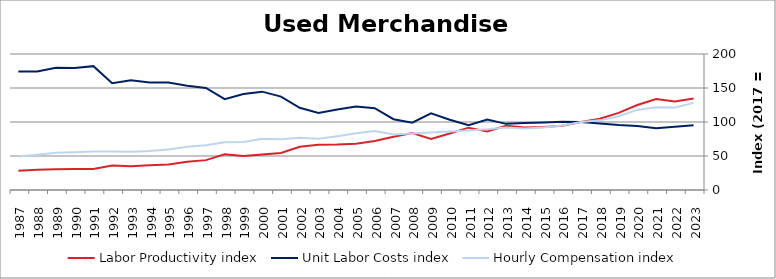
| Category | Labor Productivity index | Unit Labor Costs index | Hourly Compensation index |
|---|---|---|---|
| 2023.0 | 134.531 | 95.231 | 128.116 |
| 2022.0 | 130.184 | 93.104 | 121.207 |
| 2021.0 | 133.857 | 90.777 | 121.511 |
| 2020.0 | 124.947 | 94.259 | 117.774 |
| 2019.0 | 113.371 | 95.642 | 108.43 |
| 2018.0 | 104.808 | 97.713 | 102.411 |
| 2017.0 | 100 | 100 | 100 |
| 2016.0 | 94.588 | 100.33 | 94.9 |
| 2015.0 | 92.56 | 99.139 | 91.763 |
| 2014.0 | 91.969 | 98.497 | 90.587 |
| 2013.0 | 94.587 | 97.275 | 92.009 |
| 2012.0 | 86.178 | 103.668 | 89.34 |
| 2011.0 | 91.671 | 95.257 | 87.323 |
| 2010.0 | 83.139 | 103.339 | 85.915 |
| 2009.0 | 74.973 | 112.851 | 84.608 |
| 2008.0 | 83.925 | 99.089 | 83.16 |
| 2007.0 | 78.372 | 104.109 | 81.592 |
| 2006.0 | 72.18 | 120.253 | 86.799 |
| 2005.0 | 67.98 | 122.825 | 83.497 |
| 2004.0 | 66.872 | 118.262 | 79.084 |
| 2003.0 | 66.526 | 113.404 | 75.443 |
| 2002.0 | 63.475 | 120.91 | 76.748 |
| 2001.0 | 54.341 | 137.313 | 74.617 |
| 2000.0 | 52.104 | 144.641 | 75.364 |
| 1999.0 | 50.027 | 141.178 | 70.627 |
| 1998.0 | 52.421 | 133.628 | 70.049 |
| 1997.0 | 43.938 | 150.097 | 65.95 |
| 1996.0 | 41.58 | 153.217 | 63.708 |
| 1995.0 | 37.655 | 157.917 | 59.463 |
| 1994.0 | 36.291 | 158.214 | 57.417 |
| 1993.0 | 34.836 | 161.465 | 56.247 |
| 1992.0 | 36.012 | 157.144 | 56.59 |
| 1991.0 | 30.997 | 182.151 | 56.461 |
| 1990.0 | 30.969 | 179.297 | 55.526 |
| 1989.0 | 30.531 | 179.612 | 54.838 |
| 1988.0 | 29.777 | 174.254 | 51.887 |
| 1987.0 | 28.191 | 174.308 | 49.139 |